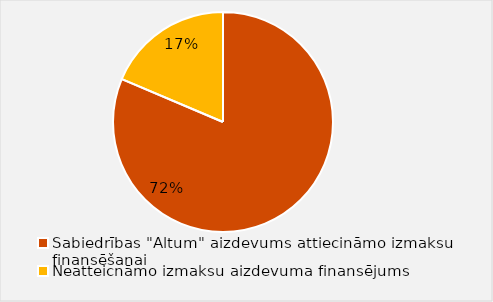
| Category | Series 0 |
|---|---|
| Sabiedrības "Altum" aizdevums attiecināmo izmaksu finansēšanai  | 0.722 |
| Neatteicnāmo izmaksu aizdevuma finansējums  | 0.165 |